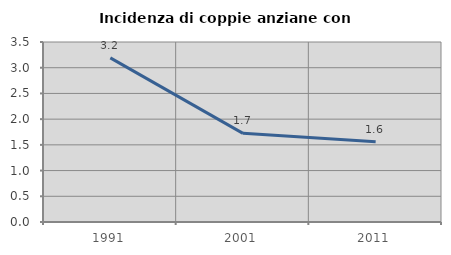
| Category | Incidenza di coppie anziane con figli |
|---|---|
| 1991.0 | 3.191 |
| 2001.0 | 1.724 |
| 2011.0 | 1.562 |